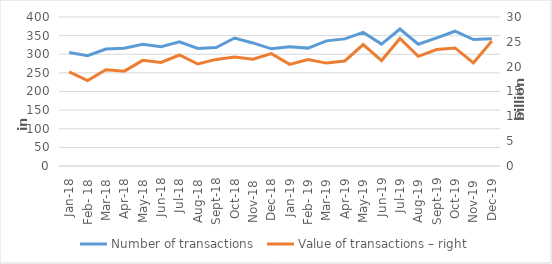
| Category | Number of transactions  |
|---|---|
| sij.18 | 304710 |
| Feb- 18 | 295986 |
| ožu.18 | 313813 |
| tra.18 | 315914 |
| svi.18 | 326704 |
| lip.18 | 320449 |
| srp.18 | 333557 |
| kol.18 | 315639 |
| ruj.18 | 317944 |
| lis.18 | 343641 |
| stu.18 | 330355 |
| pro.18 | 314597 |
| sij.19 | 320078 |
| Feb- 19 | 316492 |
| ožu.19 | 335948 |
| tra.19 | 341258 |
| svi.19 | 358577 |
| lip.19 | 327234 |
| srp.19 | 367649 |
| kol.19 | 326772 |
| ruj.19 | 344040 |
| lis.19 | 361767 |
| stu.19 | 339353 |
| pro.19 | 341408 |